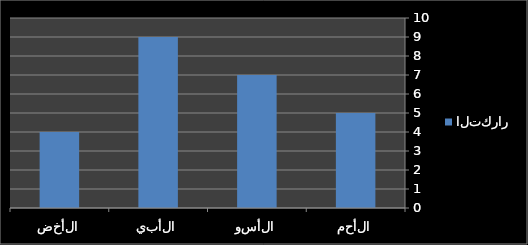
| Category | التكرار |
|---|---|
| الأحمر | 5 |
| الأسود | 7 |
| الأبيض | 9 |
| الأخضر | 4 |